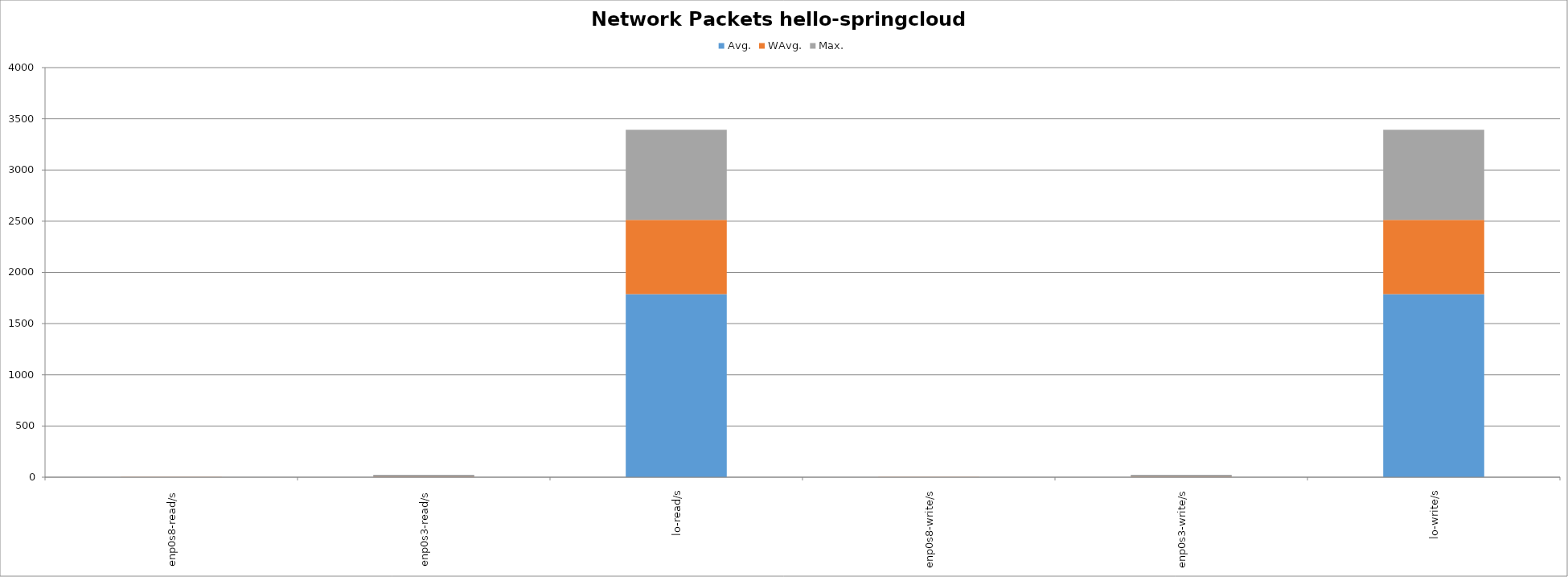
| Category | Avg. | WAvg. | Max. |
|---|---|---|---|
| enp0s8-read/s | 0.175 | 1.111 | 0.714 |
| enp0s3-read/s | 3.109 | 4.627 | 15.964 |
| lo-read/s | 1788.354 | 723.517 | 880.629 |
| enp0s8-write/s | 0.162 | 0.991 | 0.846 |
| enp0s3-write/s | 2.602 | 3.734 | 17.364 |
| lo-write/s | 1788.354 | 723.517 | 880.629 |